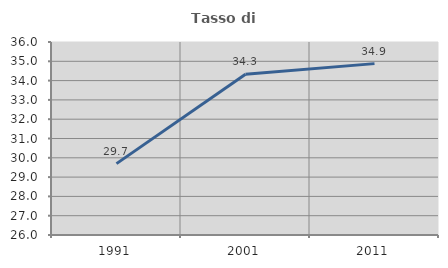
| Category | Tasso di occupazione   |
|---|---|
| 1991.0 | 29.698 |
| 2001.0 | 34.33 |
| 2011.0 | 34.88 |